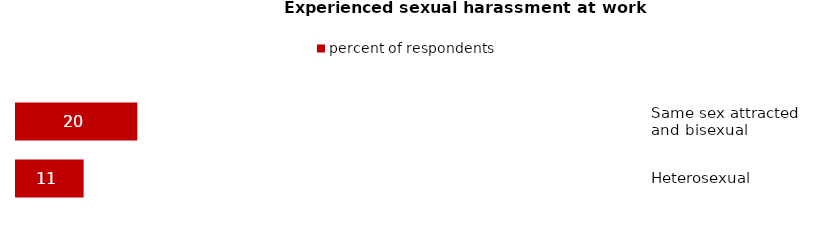
| Category | percent of respondents |
|---|---|
| Same sex attracted 
and bisexual | 19.6 |
| Heterosexual | 11 |